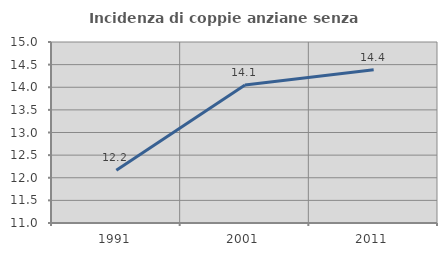
| Category | Incidenza di coppie anziane senza figli  |
|---|---|
| 1991.0 | 12.168 |
| 2001.0 | 14.05 |
| 2011.0 | 14.389 |